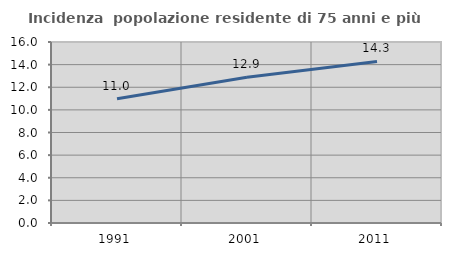
| Category | Incidenza  popolazione residente di 75 anni e più |
|---|---|
| 1991.0 | 10.985 |
| 2001.0 | 12.887 |
| 2011.0 | 14.286 |